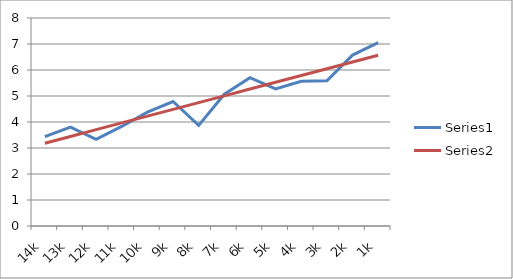
| Category | Series 0 | Series 1 |
|---|---|---|
| 14k | 3.434 | 3.184 |
| 13k | 3.807 | 3.445 |
| 12k | 3.332 | 3.705 |
| 11k | 3.829 | 3.965 |
| 10k | 4.382 | 4.226 |
| 9k | 4.787 | 4.486 |
| 8k | 3.871 | 4.746 |
| 7k | 5.069 | 5.007 |
| 6k | 5.704 | 5.267 |
| 5k | 5.273 | 5.527 |
| 4k | 5.568 | 5.788 |
| 3k | 5.587 | 6.048 |
| 2k | 6.574 | 6.308 |
| 1k | 7.056 | 6.569 |